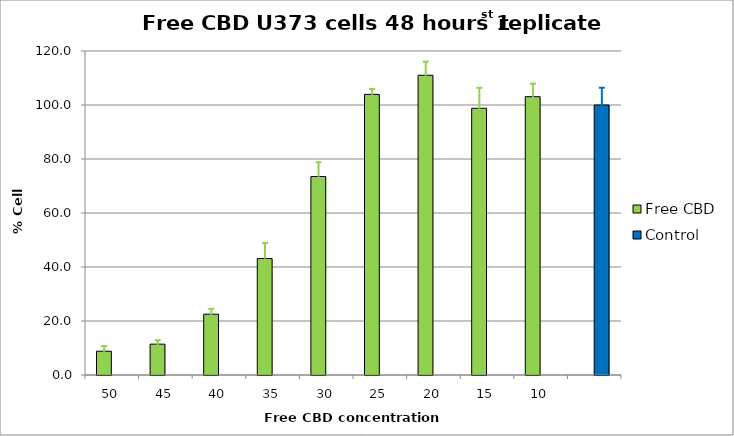
| Category | Free CBD | Control |
|---|---|---|
| 50.0 | 8.818 |  |
| 45.0 | 11.43 |  |
| 40.0 | 22.519 |  |
| 35.0 | 43.129 |  |
| 30.0 | 73.509 |  |
| 25.0 | 103.939 |  |
| 20.0 | 111.017 |  |
| 15.0 | 98.78 |  |
| 10.0 | 103.082 |  |